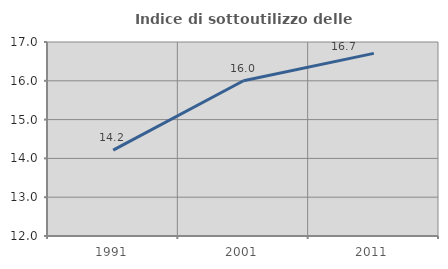
| Category | Indice di sottoutilizzo delle abitazioni  |
|---|---|
| 1991.0 | 14.212 |
| 2001.0 | 16 |
| 2011.0 | 16.706 |